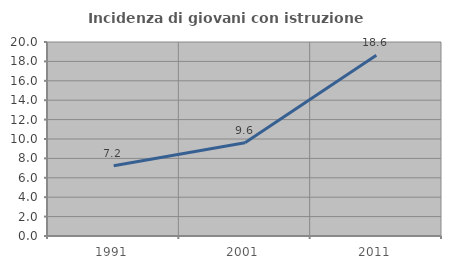
| Category | Incidenza di giovani con istruzione universitaria |
|---|---|
| 1991.0 | 7.241 |
| 2001.0 | 9.607 |
| 2011.0 | 18.623 |